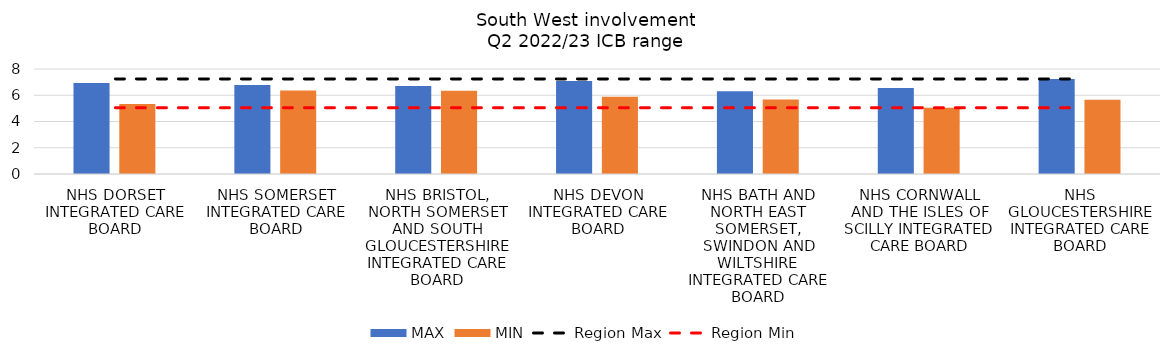
| Category | MAX | MIN |
|---|---|---|
| NHS DORSET INTEGRATED CARE BOARD | 6.924 | 5.335 |
| NHS SOMERSET INTEGRATED CARE BOARD | 6.78 | 6.353 |
| NHS BRISTOL, NORTH SOMERSET AND SOUTH GLOUCESTERSHIRE INTEGRATED CARE BOARD | 6.714 | 6.338 |
| NHS DEVON INTEGRATED CARE BOARD | 7.092 | 5.893 |
| NHS BATH AND NORTH EAST SOMERSET, SWINDON AND WILTSHIRE INTEGRATED CARE BOARD | 6.312 | 5.684 |
| NHS CORNWALL AND THE ISLES OF SCILLY INTEGRATED CARE BOARD | 6.551 | 5.052 |
| NHS GLOUCESTERSHIRE INTEGRATED CARE BOARD | 7.246 | 5.662 |